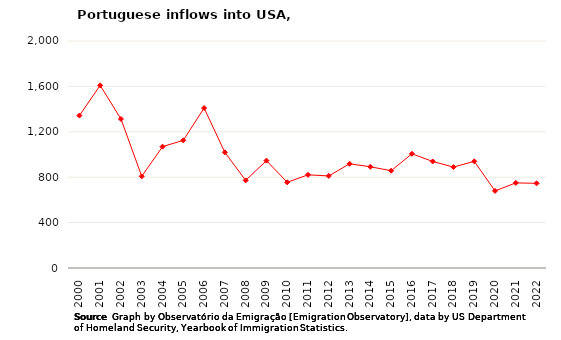
| Category | Entradas de portugueses |
|---|---|
| 2000.0 | 1343 |
| 2001.0 | 1609 |
| 2002.0 | 1313 |
| 2003.0 | 808 |
| 2004.0 | 1069 |
| 2005.0 | 1125 |
| 2006.0 | 1409 |
| 2007.0 | 1019 |
| 2008.0 | 772 |
| 2009.0 | 946 |
| 2010.0 | 755 |
| 2011.0 | 821 |
| 2012.0 | 811 |
| 2013.0 | 918 |
| 2014.0 | 892 |
| 2015.0 | 857 |
| 2016.0 | 1006 |
| 2017.0 | 939 |
| 2018.0 | 889 |
| 2019.0 | 940 |
| 2020.0 | 679 |
| 2021.0 | 750 |
| 2022.0 | 746 |